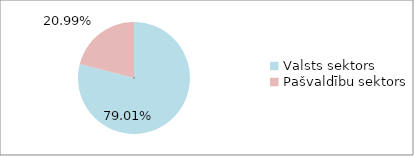
| Category | Series 0 |
|---|---|
| Valsts sektors | 0.79 |
| Pašvaldību sektors | 0.21 |